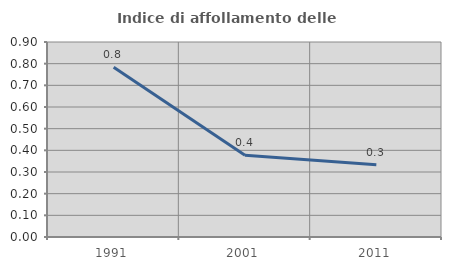
| Category | Indice di affollamento delle abitazioni  |
|---|---|
| 1991.0 | 0.784 |
| 2001.0 | 0.378 |
| 2011.0 | 0.333 |